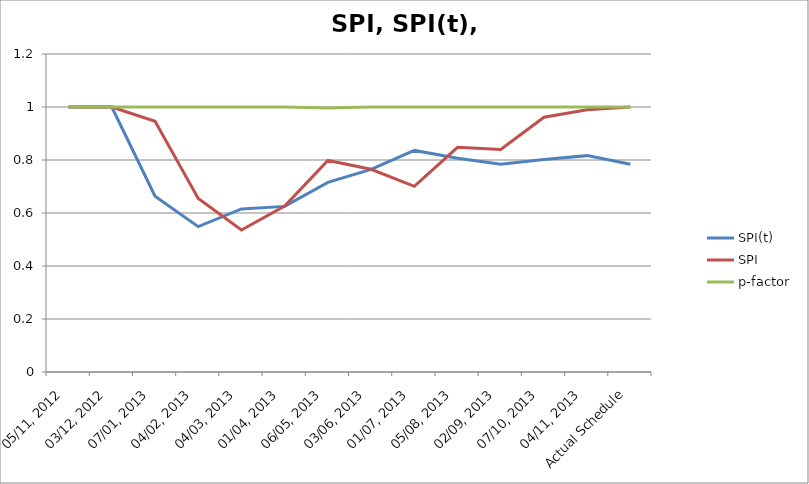
| Category | SPI(t) | SPI | p-factor |
|---|---|---|---|
| 05/11, 2012 | 1 | 1 | 1 |
| 03/12, 2012 | 1 | 1 | 1 |
| 07/01, 2013 | 0.663 | 0.946 | 1 |
| 04/02, 2013 | 0.549 | 0.655 | 1 |
| 04/03, 2013 | 0.615 | 0.536 | 1 |
| 01/04, 2013 | 0.625 | 0.626 | 1 |
| 06/05, 2013 | 0.715 | 0.798 | 0.996 |
| 03/06, 2013 | 0.764 | 0.765 | 1 |
| 01/07, 2013 | 0.836 | 0.701 | 1 |
| 05/08, 2013 | 0.807 | 0.848 | 1 |
| 02/09, 2013 | 0.784 | 0.839 | 1 |
| 07/10, 2013 | 0.802 | 0.961 | 1 |
| 04/11, 2013 | 0.816 | 0.99 | 1 |
| Actual Schedule | 0.784 | 1 | 1 |